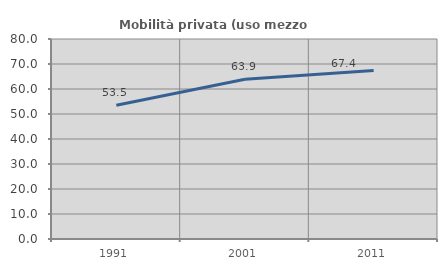
| Category | Mobilità privata (uso mezzo privato) |
|---|---|
| 1991.0 | 53.481 |
| 2001.0 | 63.895 |
| 2011.0 | 67.374 |